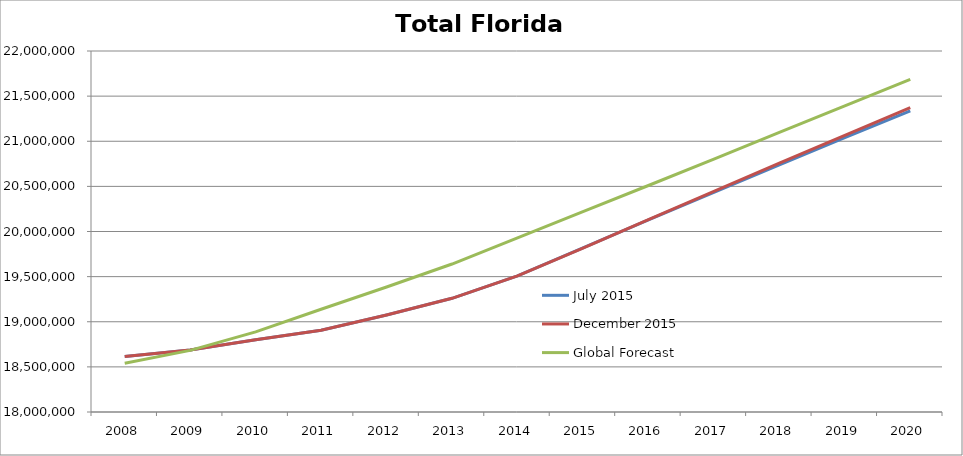
| Category | July 2015 | December 2015 | Global Forecast |
|---|---|---|---|
| 2008.0 | 18613905 | 18613905 | 18540761.091 |
| 2009.0 | 18687425 | 18687425 | 18682785.245 |
| 2010.0 | 18801332 | 18801332 | 18888260.75 |
| 2011.0 | 18905070 | 18905070 | 19138125.527 |
| 2012.0 | 19074434 | 19074434 | 19385501.633 |
| 2013.0 | 19259543 | 19259543 | 19639620.056 |
| 2014.0 | 19507369 | 19507369 | 19929392.636 |
| 2015.0 | 19817596 | 19815183 | 20220997.203 |
| 2016.0 | 20127723 | 20130780 | 20509577.018 |
| 2017.0 | 20434731 | 20445808 | 20801743.421 |
| 2018.0 | 20738328 | 20757668 | 21097166.279 |
| 2019.0 | 21039709 | 21066063 | 21391948.767 |
| 2020.0 | 21337694 | 21372207 | 21685773.591 |